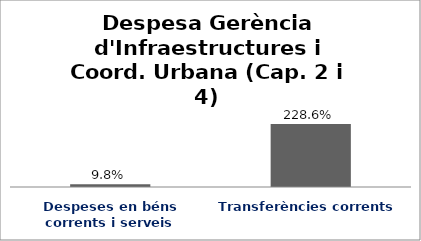
| Category | Series 0 |
|---|---|
| Despeses en béns corrents i serveis | 0.098 |
| Transferències corrents | 2.286 |